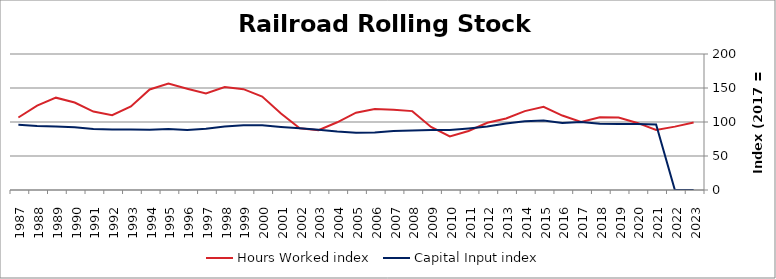
| Category | Hours Worked index | Capital Input index |
|---|---|---|
| 2023.0 | 99.269 | 0 |
| 2022.0 | 93.22 | 0 |
| 2021.0 | 88.251 | 96.496 |
| 2020.0 | 98.621 | 97.085 |
| 2019.0 | 106.614 | 96.975 |
| 2018.0 | 106.938 | 97.446 |
| 2017.0 | 100 | 100 |
| 2016.0 | 109.511 | 98.686 |
| 2015.0 | 122.277 | 102.3 |
| 2014.0 | 116.012 | 101.249 |
| 2013.0 | 105.21 | 97.653 |
| 2012.0 | 98.837 | 93.547 |
| 2011.0 | 86.847 | 90.54 |
| 2010.0 | 78.753 | 88.144 |
| 2009.0 | 92.788 | 88.242 |
| 2008.0 | 116.012 | 87.549 |
| 2007.0 | 117.956 | 86.763 |
| 2006.0 | 119.086 | 84.607 |
| 2005.0 | 113.653 | 84.153 |
| 2004.0 | 99.585 | 85.982 |
| 2003.0 | 87.924 | 88.658 |
| 2002.0 | 90.781 | 90.732 |
| 2001.0 | 112.349 | 92.726 |
| 2000.0 | 137.411 | 95.245 |
| 1999.0 | 148.3 | 95.083 |
| 1998.0 | 151.468 | 93.416 |
| 1997.0 | 142.016 | 90.091 |
| 1996.0 | 148.929 | 88.21 |
| 1995.0 | 156.491 | 89.655 |
| 1994.0 | 147.812 | 88.631 |
| 1993.0 | 122.934 | 88.871 |
| 1992.0 | 110.009 | 89.131 |
| 1991.0 | 115.357 | 89.877 |
| 1990.0 | 128.627 | 92.178 |
| 1989.0 | 135.792 | 93.47 |
| 1988.0 | 124.095 | 94.207 |
| 1987.0 | 106.602 | 95.834 |